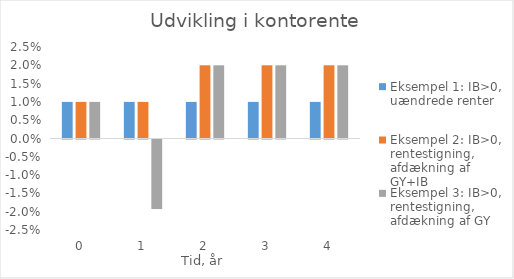
| Category | Eksempel 1: IB>0, uændrede renter | Eksempel 2: IB>0, rentestigning, afdækning af GY+IB | Eksempel 3: IB>0, rentestigning, afdækning af GY |
|---|---|---|---|
| 0.0 | 0.01 | 0.01 | 0.01 |
| 1.0 | 0.01 | 0.01 | -0.019 |
| 2.0 | 0.01 | 0.02 | 0.02 |
| 3.0 | 0.01 | 0.02 | 0.02 |
| 4.0 | 0.01 | 0.02 | 0.02 |